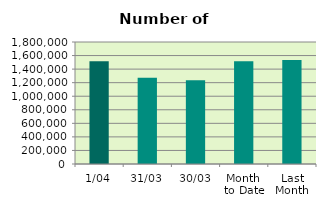
| Category | Series 0 |
|---|---|
| 1/04 | 1515240 |
| 31/03 | 1270802 |
| 30/03 | 1236166 |
| Month 
to Date | 1515240 |
| Last
Month | 1535393.739 |